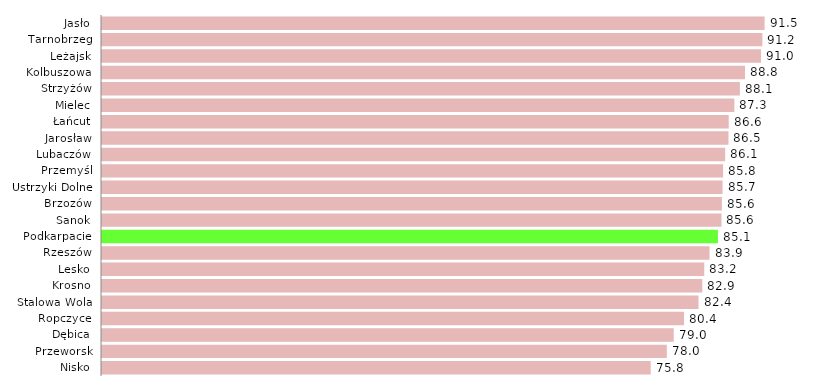
| Category | staże |
|---|---|
| Nisko | 75.787 |
| Przeworsk | 78.014 |
| Dębica | 78.968 |
| Ropczyce | 80.392 |
| Stalowa Wola | 82.392 |
| Krosno | 82.917 |
| Lesko | 83.186 |
| Rzeszów | 83.91 |
| Podkarpacie | 85.072 |
| Sanok | 85.561 |
| Brzozów | 85.619 |
| Ustrzyki Dolne | 85.714 |
| Przemyśl | 85.784 |
| Lubaczów | 86.076 |
| Jarosław | 86.528 |
| Łańcut | 86.562 |
| Mielec | 87.342 |
| Strzyżów | 88.103 |
| Kolbuszowa | 88.816 |
| Leżajsk | 91.018 |
| Tarnobrzeg | 91.216 |
| Jasło | 91.52 |